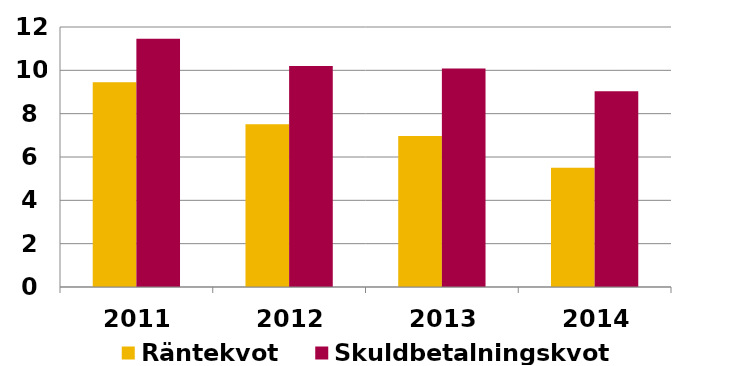
| Category | Räntekvot | Skuldbetalningskvot |
|---|---|---|
| 2011.0 | 9.45 | 11.46 |
| 2012.0 | 7.506 | 10.201 |
| 2013.0 | 6.974 | 10.082 |
| 2014.0 | 5.509 | 9.033 |